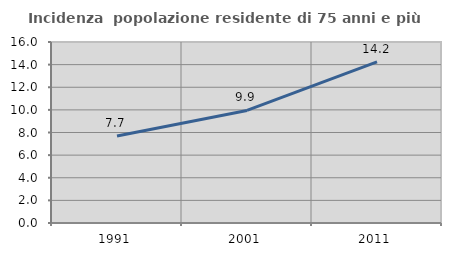
| Category | Incidenza  popolazione residente di 75 anni e più |
|---|---|
| 1991.0 | 7.686 |
| 2001.0 | 9.948 |
| 2011.0 | 14.243 |